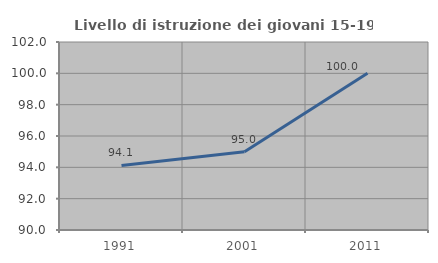
| Category | Livello di istruzione dei giovani 15-19 anni |
|---|---|
| 1991.0 | 94.118 |
| 2001.0 | 95 |
| 2011.0 | 100 |